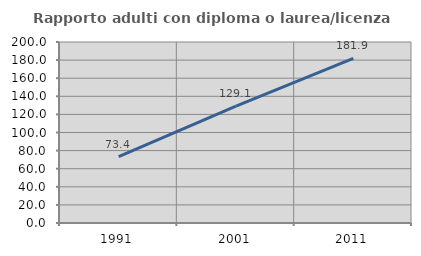
| Category | Rapporto adulti con diploma o laurea/licenza media  |
|---|---|
| 1991.0 | 73.404 |
| 2001.0 | 129.134 |
| 2011.0 | 181.944 |